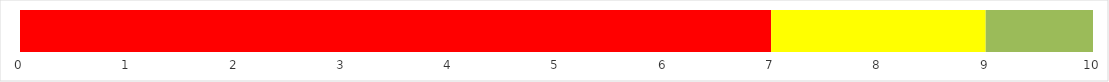
| Category | Series 0 | Series 1 | Series 2 |
|---|---|---|---|
| 0 | 7 | 2 | 1 |